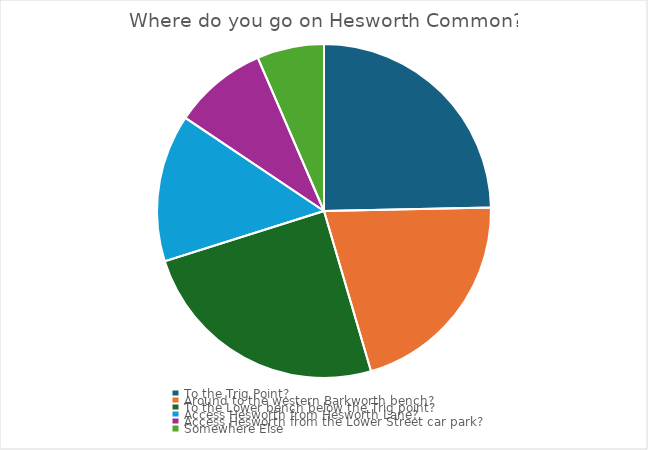
| Category | Series 0 |
|---|---|
| To the Trig Point? | 19 |
| Around to the western Barkworth bench? | 16 |
| To the Lower bench below the Trig point? | 19 |
| Access Hesworth from Hesworth Lane? | 11 |
| Access Hesworth from the Lower Street car park? | 7 |
| Somewhere Else | 5 |